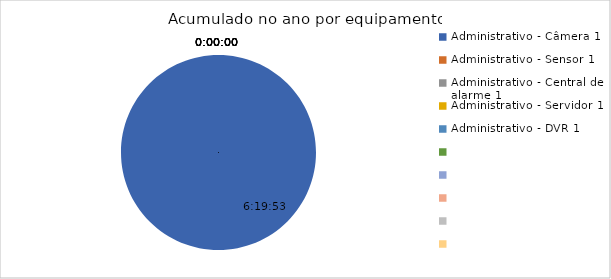
| Category | Total |
|---|---|
| Administrativo - Câmera 1 | 0.264 |
| Administrativo - Sensor 1 | 0 |
| Administrativo - Central de alarme 1 | 0 |
| Administrativo - Servidor 1 | 0 |
| Administrativo - DVR 1 | 0 |